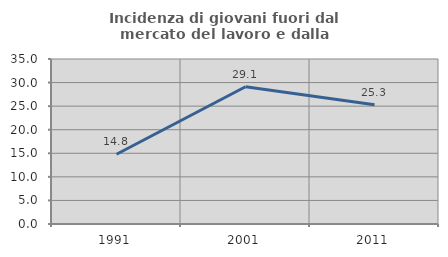
| Category | Incidenza di giovani fuori dal mercato del lavoro e dalla formazione  |
|---|---|
| 1991.0 | 14.795 |
| 2001.0 | 29.119 |
| 2011.0 | 25.285 |